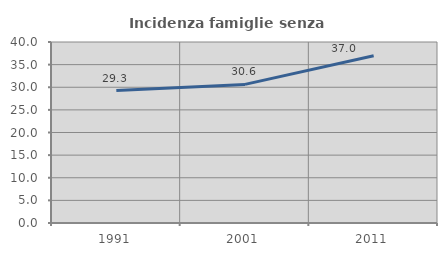
| Category | Incidenza famiglie senza nuclei |
|---|---|
| 1991.0 | 29.268 |
| 2001.0 | 30.631 |
| 2011.0 | 36.979 |